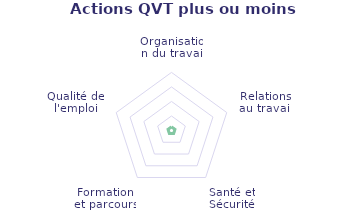
| Category | Pondération action |
|---|---|
| Organisation du travail | 0 |
| Relations au travail | 0 |
| Santé et Sécurité | 0 |
| Formation et parcours | 0 |
| Qualité de l'emploi | 0 |